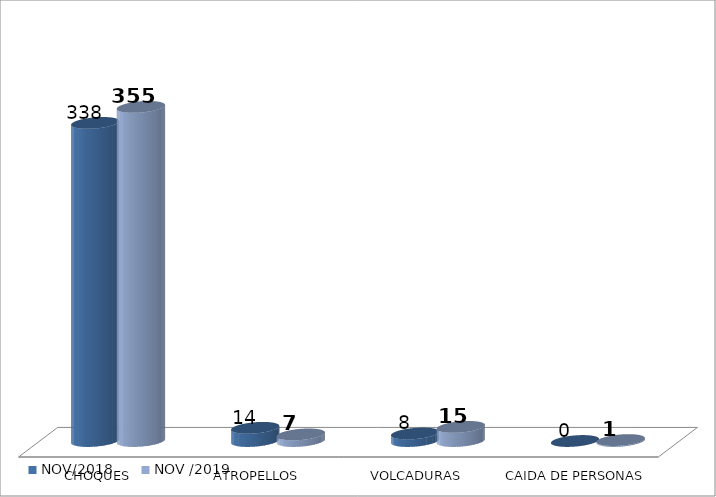
| Category | NOV/2018 | NOV /2019 |
|---|---|---|
| CHOQUES | 338 | 355 |
| ATROPELLOS | 14 | 7 |
| VOLCADURAS | 8 | 15 |
| CAIDA DE PERSONAS | 0 | 1 |